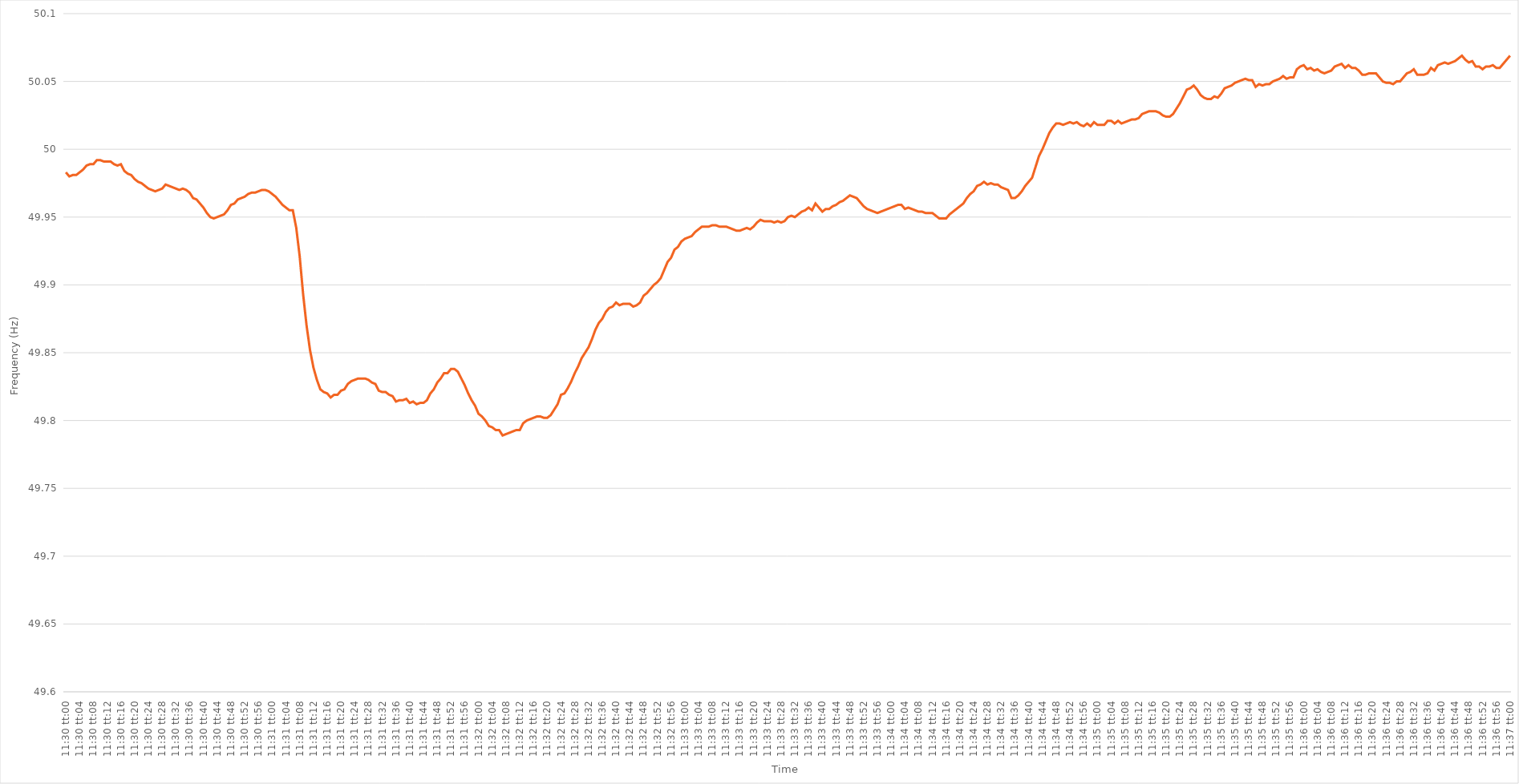
| Category | Series 0 |
|---|---|
| 0.4791666666666667 | 49.983 |
| 0.4791782407407407 | 49.98 |
| 0.4791898148148148 | 49.981 |
| 0.47920138888888886 | 49.981 |
| 0.47921296296296295 | 49.983 |
| 0.479224537037037 | 49.985 |
| 0.47923611111111114 | 49.988 |
| 0.4792476851851852 | 49.989 |
| 0.4792592592592593 | 49.989 |
| 0.4792708333333333 | 49.992 |
| 0.4792824074074074 | 49.992 |
| 0.47929398148148145 | 49.991 |
| 0.4793055555555556 | 49.991 |
| 0.47931712962962963 | 49.991 |
| 0.47932870370370373 | 49.989 |
| 0.47934027777777777 | 49.988 |
| 0.47935185185185186 | 49.989 |
| 0.4793634259259259 | 49.984 |
| 0.47937500000000005 | 49.982 |
| 0.4793865740740741 | 49.981 |
| 0.4793981481481482 | 49.978 |
| 0.4794097222222222 | 49.976 |
| 0.47942129629629626 | 49.975 |
| 0.47943287037037036 | 49.973 |
| 0.4794444444444444 | 49.971 |
| 0.47945601851851855 | 49.97 |
| 0.4794675925925926 | 49.969 |
| 0.4794791666666667 | 49.97 |
| 0.4794907407407407 | 49.971 |
| 0.4795023148148148 | 49.974 |
| 0.47951388888888885 | 49.973 |
| 0.479525462962963 | 49.972 |
| 0.47953703703703704 | 49.971 |
| 0.47954861111111113 | 49.97 |
| 0.4795601851851852 | 49.971 |
| 0.47957175925925927 | 49.97 |
| 0.4795833333333333 | 49.968 |
| 0.47959490740740746 | 49.964 |
| 0.4796064814814815 | 49.963 |
| 0.4796180555555556 | 49.96 |
| 0.47962962962962963 | 49.957 |
| 0.47964120370370367 | 49.953 |
| 0.47965277777777776 | 49.95 |
| 0.4796643518518518 | 49.949 |
| 0.47967592592592595 | 49.95 |
| 0.4796875 | 49.951 |
| 0.4796990740740741 | 49.952 |
| 0.4797106481481481 | 49.955 |
| 0.4797222222222222 | 49.959 |
| 0.47973379629629626 | 49.96 |
| 0.4797453703703704 | 49.963 |
| 0.47975694444444444 | 49.964 |
| 0.47976851851851854 | 49.965 |
| 0.4797800925925926 | 49.967 |
| 0.47979166666666667 | 49.968 |
| 0.4798032407407407 | 49.968 |
| 0.47981481481481486 | 49.969 |
| 0.4798263888888889 | 49.97 |
| 0.479837962962963 | 49.97 |
| 0.47984953703703703 | 49.969 |
| 0.4798611111111111 | 49.967 |
| 0.47987268518518517 | 49.965 |
| 0.4798842592592593 | 49.962 |
| 0.47989583333333335 | 49.959 |
| 0.4799074074074074 | 49.957 |
| 0.4799189814814815 | 49.955 |
| 0.4799305555555555 | 49.955 |
| 0.4799421296296296 | 49.942 |
| 0.47995370370370366 | 49.921 |
| 0.4799652777777778 | 49.893 |
| 0.47997685185185185 | 49.87 |
| 0.47998842592592594 | 49.852 |
| 0.48 | 49.839 |
| 0.4800115740740741 | 49.83 |
| 0.4800231481481481 | 49.823 |
| 0.48003472222222227 | 49.821 |
| 0.4800462962962963 | 49.82 |
| 0.4800578703703704 | 49.817 |
| 0.48006944444444444 | 49.819 |
| 0.48008101851851853 | 49.819 |
| 0.48009259259259257 | 49.822 |
| 0.4801041666666667 | 49.823 |
| 0.48011574074074076 | 49.827 |
| 0.4801273148148148 | 49.829 |
| 0.4801388888888889 | 49.83 |
| 0.48015046296296293 | 49.831 |
| 0.480162037037037 | 49.831 |
| 0.48017361111111106 | 49.831 |
| 0.4801851851851852 | 49.83 |
| 0.48019675925925925 | 49.828 |
| 0.48020833333333335 | 49.827 |
| 0.4802199074074074 | 49.822 |
| 0.4802314814814815 | 49.821 |
| 0.4802430555555555 | 49.821 |
| 0.48025462962962967 | 49.819 |
| 0.4802662037037037 | 49.818 |
| 0.4802777777777778 | 49.814 |
| 0.48028935185185184 | 49.815 |
| 0.48030092592592594 | 49.815 |
| 0.4803125 | 49.816 |
| 0.4803240740740741 | 49.813 |
| 0.48033564814814816 | 49.814 |
| 0.4803472222222222 | 49.812 |
| 0.4803587962962963 | 49.813 |
| 0.48037037037037034 | 49.813 |
| 0.48038194444444443 | 49.815 |
| 0.48039351851851847 | 49.82 |
| 0.4804050925925926 | 49.823 |
| 0.48041666666666666 | 49.828 |
| 0.48042824074074075 | 49.831 |
| 0.4804398148148148 | 49.835 |
| 0.4804513888888889 | 49.835 |
| 0.4804629629629629 | 49.838 |
| 0.4804745370370371 | 49.838 |
| 0.4804861111111111 | 49.836 |
| 0.4804976851851852 | 49.831 |
| 0.48050925925925925 | 49.826 |
| 0.48052083333333334 | 49.82 |
| 0.4805324074074074 | 49.815 |
| 0.48054398148148153 | 49.811 |
| 0.48055555555555557 | 49.805 |
| 0.48056712962962966 | 49.803 |
| 0.4805787037037037 | 49.8 |
| 0.48059027777777774 | 49.796 |
| 0.48060185185185184 | 49.795 |
| 0.4806134259259259 | 49.793 |
| 0.480625 | 49.793 |
| 0.48063657407407406 | 49.789 |
| 0.48064814814814816 | 49.79 |
| 0.4806597222222222 | 49.791 |
| 0.4806712962962963 | 49.792 |
| 0.48068287037037033 | 49.793 |
| 0.4806944444444445 | 49.793 |
| 0.4807060185185185 | 49.798 |
| 0.4807175925925926 | 49.8 |
| 0.48072916666666665 | 49.801 |
| 0.48074074074074075 | 49.802 |
| 0.4807523148148148 | 49.803 |
| 0.48076388888888894 | 49.803 |
| 0.480775462962963 | 49.802 |
| 0.48078703703703707 | 49.802 |
| 0.4807986111111111 | 49.804 |
| 0.4808101851851852 | 49.808 |
| 0.48082175925925924 | 49.812 |
| 0.4808333333333333 | 49.819 |
| 0.48084490740740743 | 49.82 |
| 0.48085648148148147 | 49.824 |
| 0.48086805555555556 | 49.829 |
| 0.4808796296296296 | 49.835 |
| 0.4808912037037037 | 49.84 |
| 0.48090277777777773 | 49.846 |
| 0.4809143518518519 | 49.85 |
| 0.4809259259259259 | 49.854 |
| 0.4809375 | 49.86 |
| 0.48094907407407406 | 49.867 |
| 0.48096064814814815 | 49.872 |
| 0.4809722222222222 | 49.875 |
| 0.48098379629629634 | 49.88 |
| 0.4809953703703704 | 49.883 |
| 0.4810069444444445 | 49.884 |
| 0.4810185185185185 | 49.887 |
| 0.4810300925925926 | 49.885 |
| 0.48104166666666665 | 49.886 |
| 0.4810532407407408 | 49.886 |
| 0.48106481481481483 | 49.886 |
| 0.4810763888888889 | 49.884 |
| 0.48108796296296297 | 49.885 |
| 0.481099537037037 | 49.887 |
| 0.4811111111111111 | 49.892 |
| 0.48112268518518514 | 49.894 |
| 0.4811342592592593 | 49.897 |
| 0.48114583333333333 | 49.9 |
| 0.4811574074074074 | 49.902 |
| 0.48116898148148146 | 49.905 |
| 0.48118055555555556 | 49.911 |
| 0.4811921296296296 | 49.917 |
| 0.48120370370370374 | 49.92 |
| 0.4812152777777778 | 49.926 |
| 0.4812268518518519 | 49.928 |
| 0.4812384259259259 | 49.932 |
| 0.48125 | 49.934 |
| 0.48126157407407405 | 49.935 |
| 0.4812731481481482 | 49.936 |
| 0.48128472222222224 | 49.939 |
| 0.48129629629629633 | 49.941 |
| 0.48130787037037037 | 49.943 |
| 0.4813194444444444 | 49.943 |
| 0.4813310185185185 | 49.943 |
| 0.48134259259259254 | 49.944 |
| 0.4813541666666667 | 49.944 |
| 0.48136574074074073 | 49.943 |
| 0.4813773148148148 | 49.943 |
| 0.48138888888888887 | 49.943 |
| 0.48140046296296296 | 49.942 |
| 0.481412037037037 | 49.941 |
| 0.48142361111111115 | 49.94 |
| 0.4814351851851852 | 49.94 |
| 0.4814467592592593 | 49.941 |
| 0.4814583333333333 | 49.942 |
| 0.4814699074074074 | 49.941 |
| 0.48148148148148145 | 49.943 |
| 0.4814930555555556 | 49.946 |
| 0.48150462962962964 | 49.948 |
| 0.48151620370370374 | 49.947 |
| 0.4815277777777778 | 49.947 |
| 0.4815393518518518 | 49.947 |
| 0.4815509259259259 | 49.946 |
| 0.48156249999999995 | 49.947 |
| 0.4815740740740741 | 49.946 |
| 0.48158564814814814 | 49.947 |
| 0.48159722222222223 | 49.95 |
| 0.48160879629629627 | 49.951 |
| 0.48162037037037037 | 49.95 |
| 0.4816319444444444 | 49.952 |
| 0.48164351851851855 | 49.954 |
| 0.4816550925925926 | 49.955 |
| 0.4816666666666667 | 49.957 |
| 0.4816782407407407 | 49.955 |
| 0.4816898148148148 | 49.96 |
| 0.48170138888888886 | 49.957 |
| 0.481712962962963 | 49.954 |
| 0.48172453703703705 | 49.956 |
| 0.48173611111111114 | 49.956 |
| 0.4817476851851852 | 49.958 |
| 0.4817592592592593 | 49.959 |
| 0.4817708333333333 | 49.961 |
| 0.48178240740740735 | 49.962 |
| 0.4817939814814815 | 49.964 |
| 0.48180555555555554 | 49.966 |
| 0.48181712962962964 | 49.965 |
| 0.4818287037037037 | 49.964 |
| 0.48184027777777777 | 49.961 |
| 0.4818518518518518 | 49.958 |
| 0.48186342592592596 | 49.956 |
| 0.481875 | 49.955 |
| 0.4818865740740741 | 49.954 |
| 0.48189814814814813 | 49.953 |
| 0.4819097222222222 | 49.954 |
| 0.48192129629629626 | 49.955 |
| 0.4819328703703704 | 49.956 |
| 0.48194444444444445 | 49.957 |
| 0.48195601851851855 | 49.958 |
| 0.4819675925925926 | 49.959 |
| 0.4819791666666667 | 49.959 |
| 0.4819907407407407 | 49.956 |
| 0.48200231481481487 | 49.957 |
| 0.4820138888888889 | 49.956 |
| 0.48202546296296295 | 49.955 |
| 0.48203703703703704 | 49.954 |
| 0.4820486111111111 | 49.954 |
| 0.4820601851851852 | 49.953 |
| 0.4820717592592592 | 49.953 |
| 0.48208333333333336 | 49.953 |
| 0.4820949074074074 | 49.951 |
| 0.4821064814814815 | 49.949 |
| 0.48211805555555554 | 49.949 |
| 0.48212962962962963 | 49.949 |
| 0.48214120370370367 | 49.952 |
| 0.4821527777777778 | 49.954 |
| 0.48216435185185186 | 49.956 |
| 0.48217592592592595 | 49.958 |
| 0.4821875 | 49.96 |
| 0.4821990740740741 | 49.964 |
| 0.4822106481481481 | 49.967 |
| 0.4822222222222223 | 49.969 |
| 0.4822337962962963 | 49.973 |
| 0.48224537037037035 | 49.974 |
| 0.48225694444444445 | 49.976 |
| 0.4822685185185185 | 49.974 |
| 0.4822800925925926 | 49.975 |
| 0.4822916666666666 | 49.974 |
| 0.48230324074074077 | 49.974 |
| 0.4823148148148148 | 49.972 |
| 0.4823263888888889 | 49.971 |
| 0.48233796296296294 | 49.97 |
| 0.48234953703703703 | 49.964 |
| 0.4823611111111111 | 49.964 |
| 0.4823726851851852 | 49.966 |
| 0.48238425925925926 | 49.969 |
| 0.48239583333333336 | 49.973 |
| 0.4824074074074074 | 49.976 |
| 0.4824189814814815 | 49.979 |
| 0.48243055555555553 | 49.987 |
| 0.4824421296296297 | 49.995 |
| 0.4824537037037037 | 50 |
| 0.4824652777777778 | 50.006 |
| 0.48247685185185185 | 50.012 |
| 0.4824884259259259 | 50.016 |
| 0.4825 | 50.019 |
| 0.482511574074074 | 50.019 |
| 0.4825231481481482 | 50.018 |
| 0.4825347222222222 | 50.019 |
| 0.4825462962962963 | 50.02 |
| 0.48255787037037035 | 50.019 |
| 0.48256944444444444 | 50.02 |
| 0.4825810185185185 | 50.018 |
| 0.48259259259259263 | 50.017 |
| 0.48260416666666667 | 50.019 |
| 0.48261574074074076 | 50.017 |
| 0.4826273148148148 | 50.02 |
| 0.4826388888888889 | 50.018 |
| 0.48265046296296293 | 50.018 |
| 0.4826620370370371 | 50.018 |
| 0.4826736111111111 | 50.021 |
| 0.4826851851851852 | 50.021 |
| 0.48269675925925926 | 50.019 |
| 0.48270833333333335 | 50.021 |
| 0.4827199074074074 | 50.019 |
| 0.48273148148148143 | 50.02 |
| 0.4827430555555556 | 50.021 |
| 0.4827546296296296 | 50.022 |
| 0.4827662037037037 | 50.022 |
| 0.48277777777777775 | 50.023 |
| 0.48278935185185184 | 50.026 |
| 0.4828009259259259 | 50.027 |
| 0.48281250000000003 | 50.028 |
| 0.48282407407407407 | 50.028 |
| 0.48283564814814817 | 50.028 |
| 0.4828472222222222 | 50.027 |
| 0.4828587962962963 | 50.025 |
| 0.48287037037037034 | 50.024 |
| 0.4828819444444445 | 50.024 |
| 0.4828935185185185 | 50.026 |
| 0.4829050925925926 | 50.03 |
| 0.48291666666666666 | 50.034 |
| 0.48292824074074076 | 50.039 |
| 0.4829398148148148 | 50.044 |
| 0.48295138888888894 | 50.045 |
| 0.482962962962963 | 50.047 |
| 0.482974537037037 | 50.044 |
| 0.4829861111111111 | 50.04 |
| 0.48299768518518515 | 50.038 |
| 0.48300925925925925 | 50.037 |
| 0.4830208333333333 | 50.037 |
| 0.48303240740740744 | 50.039 |
| 0.4830439814814815 | 50.038 |
| 0.48305555555555557 | 50.041 |
| 0.4830671296296296 | 50.045 |
| 0.4830787037037037 | 50.046 |
| 0.48309027777777774 | 50.047 |
| 0.4831018518518519 | 50.049 |
| 0.48311342592592593 | 50.05 |
| 0.483125 | 50.051 |
| 0.48313657407407407 | 50.052 |
| 0.48314814814814816 | 50.051 |
| 0.4831597222222222 | 50.051 |
| 0.48317129629629635 | 50.046 |
| 0.4831828703703704 | 50.048 |
| 0.4831944444444444 | 50.047 |
| 0.4832060185185185 | 50.048 |
| 0.48321759259259256 | 50.048 |
| 0.48322916666666665 | 50.05 |
| 0.4832407407407407 | 50.051 |
| 0.48325231481481484 | 50.052 |
| 0.4832638888888889 | 50.054 |
| 0.483275462962963 | 50.052 |
| 0.483287037037037 | 50.053 |
| 0.4832986111111111 | 50.053 |
| 0.48331018518518515 | 50.059 |
| 0.4833217592592593 | 50.061 |
| 0.48333333333333334 | 50.062 |
| 0.48334490740740743 | 50.059 |
| 0.48335648148148147 | 50.06 |
| 0.48336805555555556 | 50.058 |
| 0.4833796296296296 | 50.059 |
| 0.48339120370370375 | 50.057 |
| 0.4834027777777778 | 50.056 |
| 0.4834143518518519 | 50.057 |
| 0.4834259259259259 | 50.058 |
| 0.48343749999999996 | 50.061 |
| 0.48344907407407406 | 50.062 |
| 0.4834606481481481 | 50.063 |
| 0.48347222222222225 | 50.06 |
| 0.4834837962962963 | 50.062 |
| 0.4834953703703704 | 50.06 |
| 0.4835069444444444 | 50.06 |
| 0.4835185185185185 | 50.058 |
| 0.48353009259259255 | 50.055 |
| 0.4835416666666667 | 50.055 |
| 0.48355324074074074 | 50.056 |
| 0.48356481481481484 | 50.056 |
| 0.4835763888888889 | 50.056 |
| 0.48358796296296297 | 50.053 |
| 0.483599537037037 | 50.05 |
| 0.48361111111111116 | 50.049 |
| 0.4836226851851852 | 50.049 |
| 0.4836342592592593 | 50.048 |
| 0.48364583333333333 | 50.05 |
| 0.4836574074074074 | 50.05 |
| 0.48366898148148146 | 50.053 |
| 0.4836805555555555 | 50.056 |
| 0.48369212962962965 | 50.057 |
| 0.4837037037037037 | 50.059 |
| 0.4837152777777778 | 50.055 |
| 0.4837268518518518 | 50.055 |
| 0.4837384259259259 | 50.055 |
| 0.48374999999999996 | 50.056 |
| 0.4837615740740741 | 50.06 |
| 0.48377314814814815 | 50.058 |
| 0.48378472222222224 | 50.062 |
| 0.4837962962962963 | 50.063 |
| 0.4838078703703704 | 50.064 |
| 0.4838194444444444 | 50.063 |
| 0.48383101851851856 | 50.064 |
| 0.4838425925925926 | 50.065 |
| 0.4838541666666667 | 50.067 |
| 0.48386574074074074 | 50.069 |
| 0.48387731481481483 | 50.066 |
| 0.48388888888888887 | 50.064 |
| 0.483900462962963 | 50.065 |
| 0.48391203703703706 | 50.061 |
| 0.4839236111111111 | 50.061 |
| 0.4839351851851852 | 50.059 |
| 0.48394675925925923 | 50.061 |
| 0.4839583333333333 | 50.061 |
| 0.48396990740740736 | 50.062 |
| 0.4839814814814815 | 50.06 |
| 0.48399305555555555 | 50.06 |
| 0.48400462962962965 | 50.063 |
| 0.4840162037037037 | 50.066 |
| 0.4840277777777778 | 50.069 |